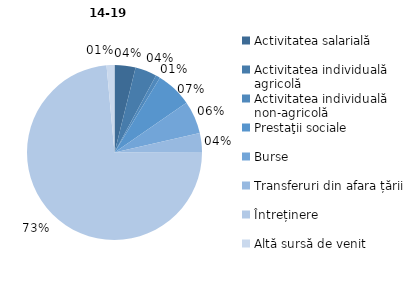
| Category | 14-19 ani | 30-34 ani |
|---|---|---|
| Activitatea salarială | 3.883 | 51.505 |
| Activitatea individuală agricolă | 3.986 | 10.104 |
| Activitatea individuală non-agricolă | 0.813 | 8.574 |
| Prestaţii sociale | 6.671 | 13.345 |
| Burse | 6.069 | 0 |
| Transferuri din afara țării | 3.627 | 12.311 |
| Întreținere | 73.494 | 4.007 |
| Altă sursă de venit | 1.457 | 0.153 |